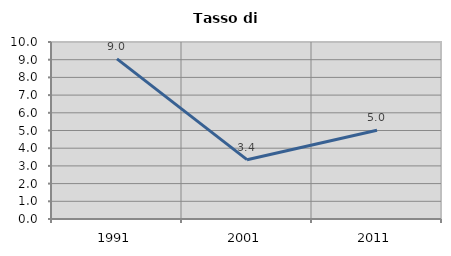
| Category | Tasso di disoccupazione   |
|---|---|
| 1991.0 | 9.045 |
| 2001.0 | 3.351 |
| 2011.0 | 5.018 |